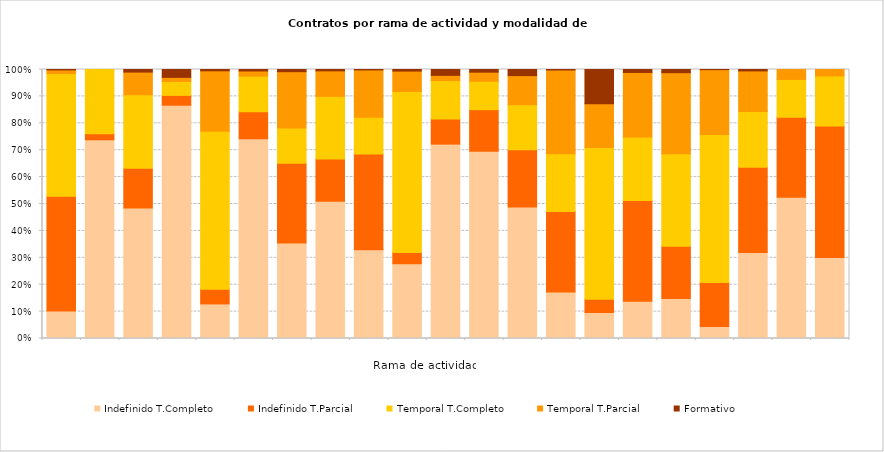
| Category | Indefinido T.Completo | Indefinido T.Parcial | Temporal T.Completo | Temporal T.Parcial | Formativo |
|---|---|---|---|---|---|
| 0 | 309 | 1294 | 1382 | 41 | 5 |
| 1 | 65 | 2 | 21 | 0 | 0 |
| 2 | 10468 | 3175 | 5898 | 1815 | 208 |
| 3 | 1541 | 65 | 92 | 27 | 52 |
| 4 | 1125 | 480 | 5135 | 1968 | 43 |
| 5 | 49697 | 6733 | 8863 | 1275 | 372 |
| 6 | 39480 | 32996 | 14645 | 23242 | 908 |
| 7 | 33828 | 10399 | 15429 | 6284 | 334 |
| 8 | 51470 | 55491 | 21422 | 27361 | 259 |
| 9 | 42605 | 6396 | 91829 | 11596 | 897 |
| 10 | 12139 | 1563 | 2407 | 323 | 366 |
| 11 | 5740 | 1277 | 870 | 280 | 82 |
| 12 | 52536 | 22833 | 17963 | 11624 | 2435 |
| 13 | 30708 | 53001 | 38138 | 55275 | 344 |
| 14 | 622 | 316 | 3627 | 1051 | 817 |
| 15 | 8374 | 22576 | 14197 | 14481 | 663 |
| 16 | 11694 | 15304 | 27112 | 23774 | 930 |
| 17 | 4074 | 14895 | 50224 | 21965 | 57 |
| 18 | 7609 | 7530 | 4924 | 3595 | 126 |
| 19 | 18429 | 10412 | 4936 | 1291 | 0 |
| 20 | 163 | 265 | 101 | 13 | 0 |